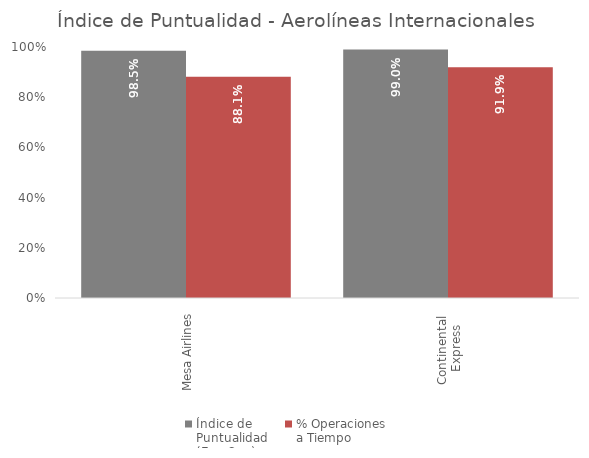
| Category | Índice de 
Puntualidad
(Ene-Sep) | % Operaciones 
a Tiempo |
|---|---|---|
| Mesa Airlines | 0.985 | 0.881 |
| Continental 
Express | 0.99 | 0.919 |